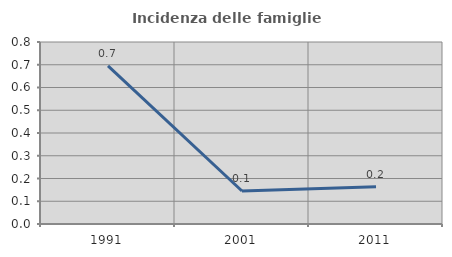
| Category | Incidenza delle famiglie numerose |
|---|---|
| 1991.0 | 0.695 |
| 2001.0 | 0.145 |
| 2011.0 | 0.164 |